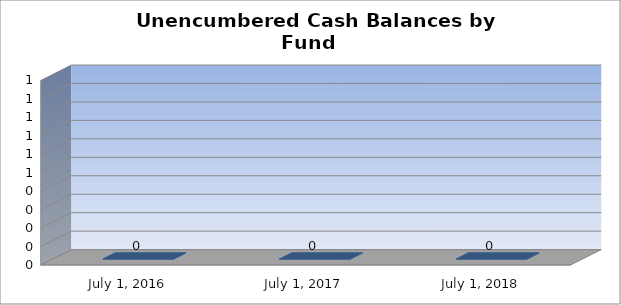
| Category | Series 0 |
|---|---|
| July 1, 2016 | 0 |
| July 1, 2017 | 0 |
| July 1, 2018 | 0 |